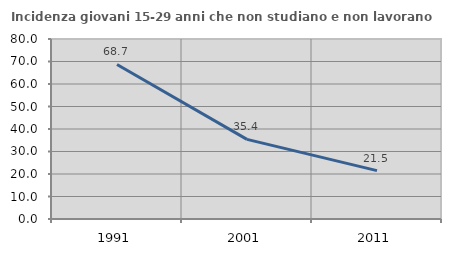
| Category | Incidenza giovani 15-29 anni che non studiano e non lavorano  |
|---|---|
| 1991.0 | 68.677 |
| 2001.0 | 35.404 |
| 2011.0 | 21.481 |